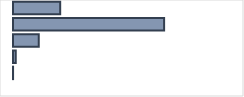
| Category | Series 0 |
|---|---|
| 0 | 20.789 |
| 1 | 66.569 |
| 2 | 11.362 |
| 3 | 1.252 |
| 4 | 0.029 |